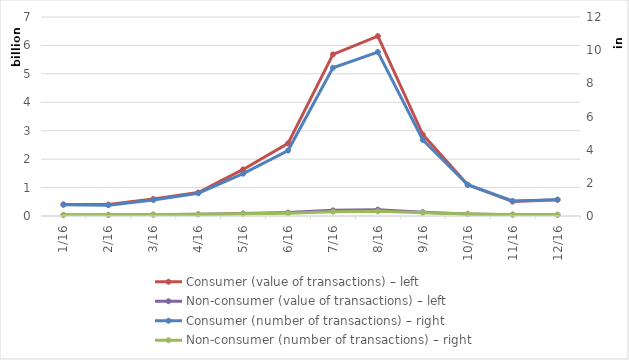
| Category | Consumer (value of transactions) – left | Non-consumer (value of transactions) – left |
|---|---|---|
| 2016-01-01 | 408601754 | 33254274 |
| 2016-02-01 | 402364495 | 36404884 |
| 2016-03-01 | 599845846 | 47493182 |
| 2016-04-01 | 823183726 | 61399429 |
| 2016-05-01 | 1637369451 | 92124946 |
| 2016-06-01 | 2555504923 | 120646854 |
| 2016-07-01 | 5684342966 | 197974790 |
| 2016-08-01 | 6329188412 | 222926873 |
| 2016-09-01 | 2865274578 | 134852047 |
| 2016-10-01 | 1097746741 | 74607241 |
| 2016-11-01 | 506485011 | 46382553 |
| 2016-12-01 | 569418210 | 41260130 |